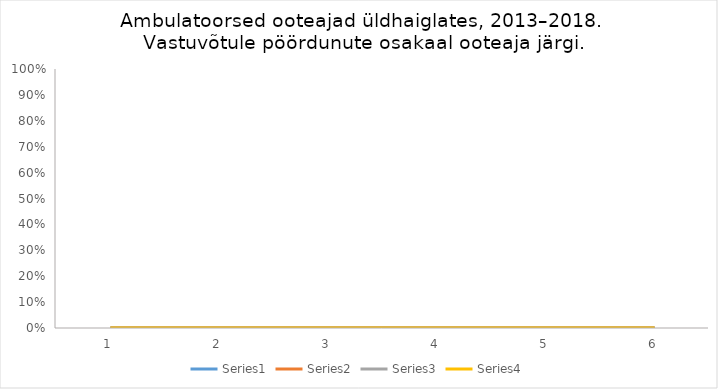
| Category | Series 0 | Series 1 | Series 2 | Series 3 |
|---|---|---|---|---|
| 0 | 0.191 | 0.226 | 0.442 | 0.141 |
| 1 | 0.211 | 0.224 | 0.435 | 0.13 |
| 2 | 0.219 | 0.215 | 0.425 | 0.142 |
| 3 | 0.21 | 0.22 | 0.43 | 0.14 |
| 4 | 0.2 | 0.23 | 0.43 | 0.14 |
| 5 | 0.2 | 0.22 | 0.44 | 0.14 |